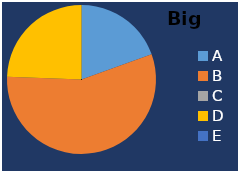
| Category | Big Basket |
|---|---|
| A | 200 |
| B | 575 |
| C | 0 |
| D | 250 |
| E | 0 |